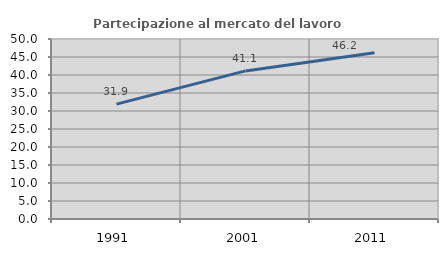
| Category | Partecipazione al mercato del lavoro  femminile |
|---|---|
| 1991.0 | 31.907 |
| 2001.0 | 41.139 |
| 2011.0 | 46.197 |